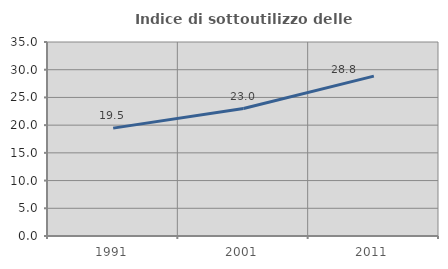
| Category | Indice di sottoutilizzo delle abitazioni  |
|---|---|
| 1991.0 | 19.462 |
| 2001.0 | 22.991 |
| 2011.0 | 28.843 |